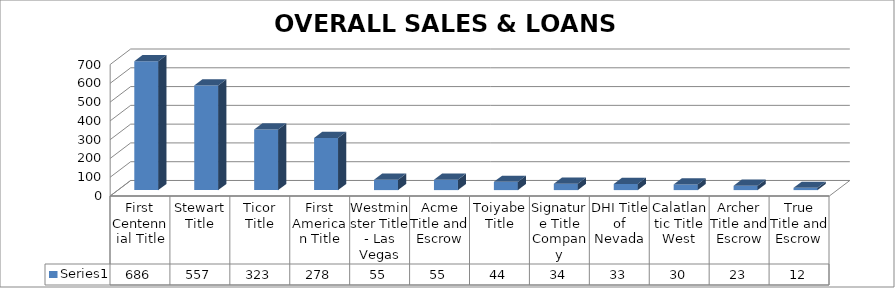
| Category | Series 0 |
|---|---|
| First Centennial Title | 686 |
| Stewart Title | 557 |
| Ticor Title | 323 |
| First American Title | 278 |
| Westminster Title - Las Vegas | 55 |
| Acme Title and Escrow | 55 |
| Toiyabe Title | 44 |
| Signature Title Company | 34 |
| DHI Title of Nevada | 33 |
| Calatlantic Title West | 30 |
| Archer Title and Escrow | 23 |
| True Title and Escrow | 12 |